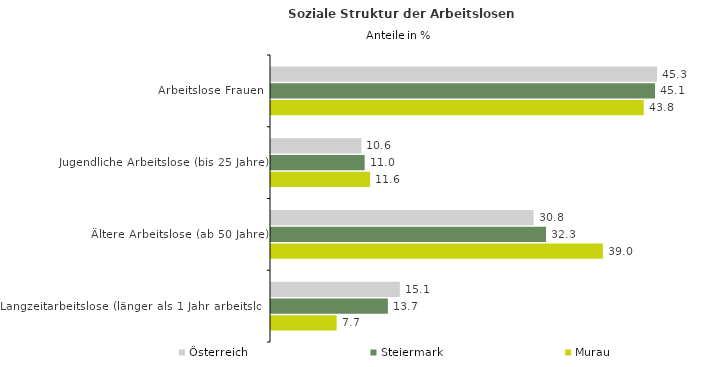
| Category | Österreich | Steiermark | Murau |
|---|---|---|---|
| Arbeitslose Frauen | 45.325 | 45.075 | 43.75 |
| Jugendliche Arbeitslose (bis 25 Jahre) | 10.608 | 10.993 | 11.628 |
| Ältere Arbeitslose (ab 50 Jahre) | 30.822 | 32.281 | 38.953 |
| Langzeitarbeitslose (länger als 1 Jahr arbeitslos) | 15.122 | 13.717 | 7.703 |